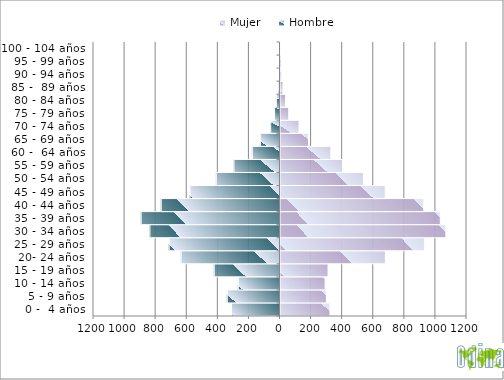
| Category | Hombre | Mujer |
|---|---|---|
| 0 -  4 años | -312 | 318 |
| 5 - 9 años | -339 | 295 |
| 10 - 14 años | -268 | 287 |
| 15 - 19 años | -423 | 306 |
| 20- 24 años | -636 | 675 |
| 25 - 29 años | -713 | 926 |
| 30 - 34 años | -837 | 1064 |
| 35 - 39 años | -893 | 1028 |
| 40 - 44 años | -764 | 922 |
| 45 - 49 años | -579 | 674 |
| 50 - 54 años | -410 | 534 |
| 55 - 59 años | -296 | 399 |
| 60 -  64 años | -178 | 324 |
| 65 - 69 años | -126 | 180 |
| 70 - 74 años | -60 | 119 |
| 75 - 79 años | -35 | 53 |
| 80 - 84 años | -23 | 33 |
| 85 -  89 años | -6 | 16 |
| 90 - 94 años | -2 | 8 |
| 95 - 99 años | 0 | 7 |
| 100 - 104 años | 0 | 1 |